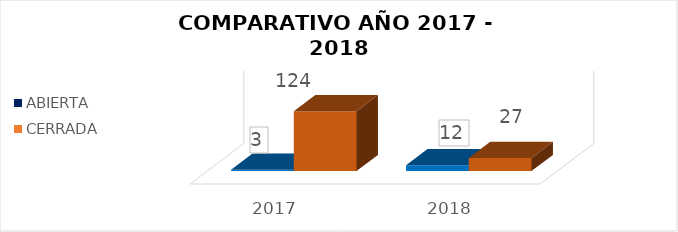
| Category | ABIERTA | CERRADA |
|---|---|---|
| 2017.0 | 3 | 124 |
| 2018.0 | 12 | 27 |